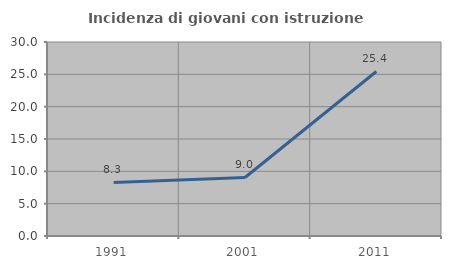
| Category | Incidenza di giovani con istruzione universitaria |
|---|---|
| 1991.0 | 8.274 |
| 2001.0 | 9.049 |
| 2011.0 | 25.444 |